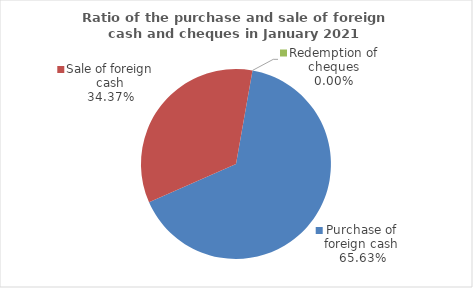
| Category | Series 0 |
|---|---|
| Purchase of foreign cash | 65.628 |
| Sale of foreign cash | 34.372 |
| Redemption of cheques | 0 |